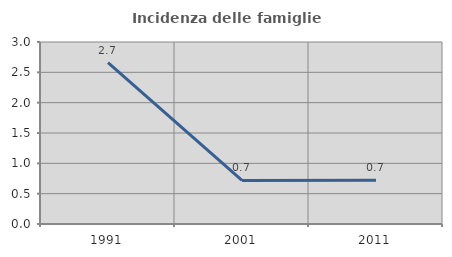
| Category | Incidenza delle famiglie numerose |
|---|---|
| 1991.0 | 2.662 |
| 2001.0 | 0.718 |
| 2011.0 | 0.719 |